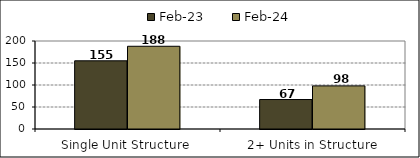
| Category | Feb-23 | Feb-24 |
|---|---|---|
| Single Unit Structure  | 155 | 188 |
| 2+ Units in Structure | 67 | 98 |